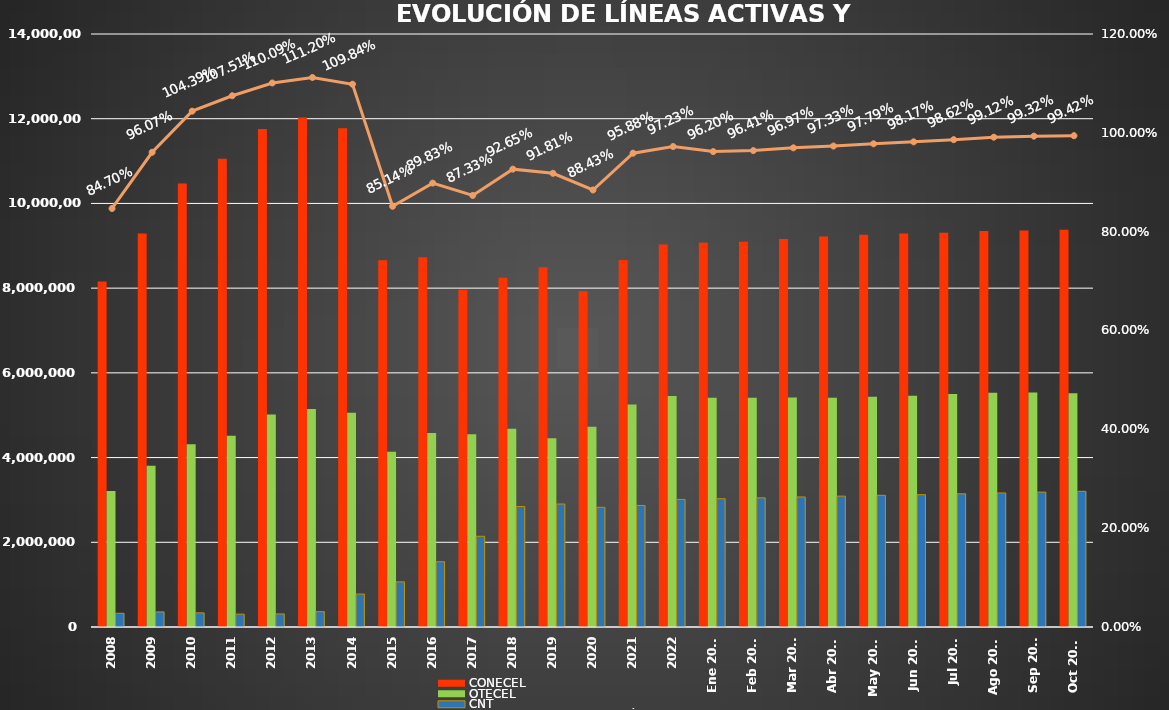
| Category | CONECEL | OTECEL | CNT |
|---|---|---|---|
| 2008 | 8156359 | 3211922 | 323967 |
| 2009 | 9291268 | 3806432 | 356900 |
| 2010 | 10470502 | 4314599 | 333730 |
| 2011 | 11057316 | 4513874 | 303368 |
| 2012 | 11757906 | 5019686 | 309271 |
| 2013 | 12030886 | 5148308 | 362560 |
| 2014 | 11772020 | 5055645 | 776892 |
| 2015 | 8658619 | 4134698 | 1065703 |
| 2016 | 8726823 | 4580092 | 1541219 |
| 2017 | 7960263 | 4549024 | 2142117 |
| 2018 | 8248050 | 4679646 | 2845142 |
| 2019 | 8493054 | 4456356 | 2903690 |
| 2020 | 7929253 | 4729725 | 2826388 |
| 2021 | 8665715 | 5254468 | 2869417 |
| 2022 | 9027737 | 5451115 | 3011899 |
| Ene 2023 | 9073421 | 5411860 | 3028254 |
| Feb 2023 | 9092490 | 5410682 | 3048837 |
| Mar 2023 | 9162562 | 5419670 | 3070611 |
| Abr 2023 | 9220042 | 5409581 | 3089410 |
| May 2023 | 9259499 | 5434175 | 3108405 |
| Jun 2023 | 9290231 | 5458655 | 3123905 |
| Jul 2023 | 9310350 | 5499232 | 3144067 |
| Ago 2023 | 9349530 | 5530451 | 3164614 |
| Sep 2023 | 9361007 | 5536629 | 3184663 |
| Oct 2023 | 9378363 | 5518632 | 3202774 |